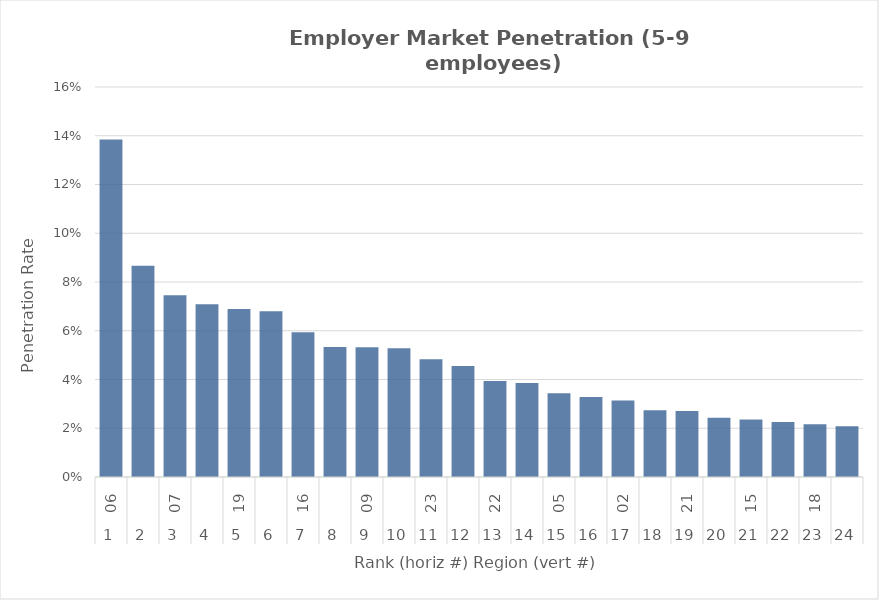
| Category | Rate |
|---|---|
| 0 | 0.138 |
| 1 | 0.087 |
| 2 | 0.075 |
| 3 | 0.071 |
| 4 | 0.069 |
| 5 | 0.068 |
| 6 | 0.059 |
| 7 | 0.053 |
| 8 | 0.053 |
| 9 | 0.053 |
| 10 | 0.048 |
| 11 | 0.046 |
| 12 | 0.039 |
| 13 | 0.039 |
| 14 | 0.034 |
| 15 | 0.033 |
| 16 | 0.031 |
| 17 | 0.027 |
| 18 | 0.027 |
| 19 | 0.024 |
| 20 | 0.024 |
| 21 | 0.023 |
| 22 | 0.022 |
| 23 | 0.021 |